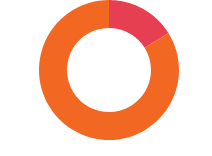
| Category | PASIVE |
|---|---|
| NESIGUR | 35700 |
| SIGUR | 185500 |